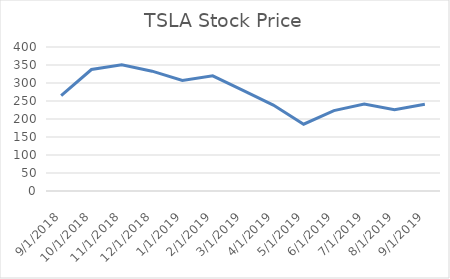
| Category | Closing Value |
|---|---|
| 9/28/18 | 264.72 |
| 10/31/18 | 337.407 |
| 11/30/18 | 350.33 |
| 12/31/18 | 332.89 |
| 1/31/19 | 306.97 |
| 2/28/19 | 319.88 |
| 3/29/19 | 279.75 |
| 4/30/19 | 238.69 |
| 5/31/19 | 185.48 |
| 6/28/19 | 223.35 |
| 7/31/19 | 241.62 |
| 8/30/19 | 225.6 |
| 9/30/19 | 240.84 |